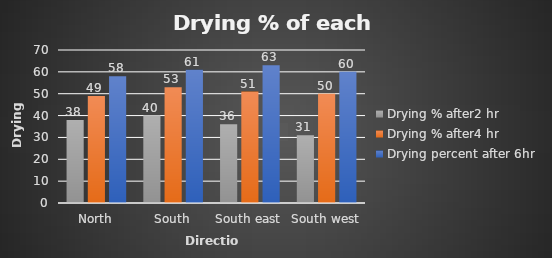
| Category | Drying % after2 hr | Drying % after4 hr | Drying percent after 6hr |
|---|---|---|---|
| North | 38 | 49 | 58 |
| South | 40 | 53 | 61 |
| South east | 36 | 51 | 63 |
| South west | 31 | 50 | 60 |